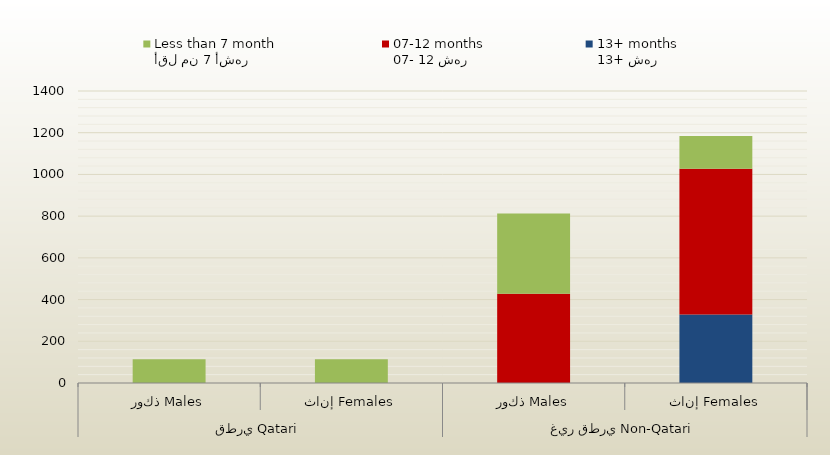
| Category | 13+ شهر
13+ months | 07- 12 شهر
07-12 months | أقل من 7 أشهر
Less than 7 month  |
|---|---|---|---|
| 0 | 0 | 0 | 114 |
| 1 | 0 | 0 | 114 |
| 2 | 0 | 428 | 385 |
| 3 | 328 | 699 | 157 |